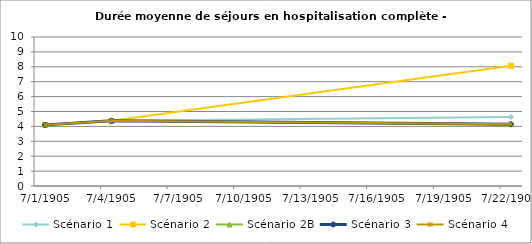
| Category | Scénario 1 | Scénario 2 | Scénario 2B | Scénario 3 | Scénario 4 |
|---|---|---|---|---|---|
| 2009.0 | 4.102 | 4.102 | 4.102 | 4.102 | 4.102 |
| 2012.0 | 4.375 | 4.375 | 4.375 | 4.375 | 4.375 |
| 2030.0 | 4.635 | 8.069 | 4.149 | 4.149 | 4.149 |